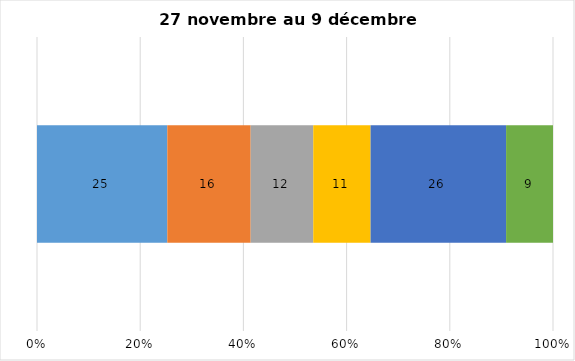
| Category | Plusieurs fois par jour | Une fois par jour | Quelques fois par semaine   | Une fois par semaine ou moins   |  Jamais   |  Je n’utilise pas les médias sociaux |
|---|---|---|---|---|---|---|
| 0 | 25 | 16 | 12 | 11 | 26 | 9 |